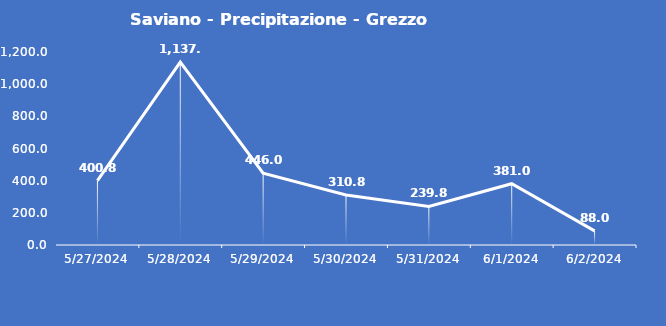
| Category | Saviano - Precipitazione - Grezzo (mm) |
|---|---|
| 5/27/24 | 400.8 |
| 5/28/24 | 1137.6 |
| 5/29/24 | 446 |
| 5/30/24 | 310.8 |
| 5/31/24 | 239.8 |
| 6/1/24 | 381 |
| 6/2/24 | 88 |